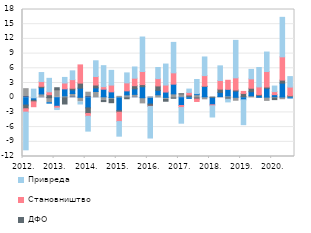
| Category | Непрофитне и друге организације | Локални ниво власти | Готов новац у oптицају | ДФО | Становништво | Привреда  |
|---|---|---|---|---|---|---|
| 2012. | 0.202 | 1.641 | -1.502 | -0.756 | -0.691 | -7.686 |
| II | 0.002 | -0.188 | -0.341 | -0.312 | -0.998 | 1.747 |
| III | 0.11 | 0.664 | 1.273 | 0.274 | 0.972 | 1.84 |
| IV | -0.138 | -0.873 | -0.098 | 0.61 | 0.594 | 2.749 |
| 2013. | 0.079 | 1.527 | -1.754 | 0.426 | -0.373 | -0.296 |
| II | 0.059 | 0.305 | 1.437 | -1.286 | 1.19 | 1.148 |
| III | 0.165 | 0.682 | 0.754 | 0.325 | 1.76 | 1.79 |
| IV | 0.076 | -0.87 | 1.873 | 1.027 | 3.718 | -0.415 |
| 2014. | 0.199 | 0.924 | -2.085 | -1.142 | -0.569 | -3.023 |
| II | 0.035 | 1.231 | 0.74 | 0.578 | 1.742 | 3.202 |
| III | 0.178 | -0.545 | 1.556 | -0.251 | 0.516 | 4.284 |
| IV | -0.104 | -0.237 | 1.19 | -0.68 | 1.391 | 3 |
| 2015. | -0.031 | 0.277 | -2.623 | -0.313 | -1.902 | -2.981 |
| II | 0.129 | 0.455 | 0.809 | -0.218 | 1.631 | 2.039 |
| III | 0.145 | 0.535 | 1.129 | 0.641 | 1.533 | 2.287 |
| IV | -0.109 | -1.155 | 2.237 | 0.437 | 2.676 | 7.032 |
| 2016. | 0.104 | -0.104 | -1.193 | -0.452 | -0.054 | -6.424 |
| II | -0.033 | 0.597 | 0.912 | 0.894 | 1.489 | 2.276 |
| III | 0.058 | -0.277 | 1.097 | -0.443 | 1.429 | 4.281 |
| IV | -0.001 | 0.781 | 1.984 | -0.118 | 2.31 | 6.213 |
| 2017. | 0.133 | 0.64 | -1.599 | 0.025 | -0.411 | -3.193 |
| II | 0.059 | 0.207 | -0.138 | 0.273 | 0.541 | 0.678 |
| III | 0.02 | 0.6 | 0.199 | -0.281 | -0.487 | 2.895 |
| IV | 0.183 | -0.435 | 2.116 | 0.066 | 2.148 | 3.798 |
| 2018. | -0.069 | 0.088 | -1.382 | 0.022 | -0.202 | -2.284 |
| II | 0.083 | 0.156 | 0.854 | 0.654 | 1.762 | 2.986 |
| III | 0.089 | 0.272 | 1.347 | -0.301 | 1.848 | -0.557 |
| IV | 0.082 | -0.727 | 1.258 | 0.234 | 2.481 | 7.641 |
| 2019. | 0.187 | 0.021 | -0.439 | 0.661 | 0.411 | -5.065 |
| II | -0.015 | 0.395 | 0.82 | 0.717 | 1.911 | 1.934 |
| III | 0.109 | -0.155 | 0.363 | 0.139 | 1.592 | 3.965 |
| IV | 0.106 | -0.756 | 1.801 | 0.269 | 3.171 | 3.974 |
| 2020. | -0.044 | 0.196 | 0.422 | -0.345 | 0.62 | 1.138 |
| II | 0.14 | -0.412 | 2.831 | 0.621 | 4.751 | 8.057 |
| III | 0.136 | 0.188 | -0.059 | 0.127 | 1.713 | 2.143 |